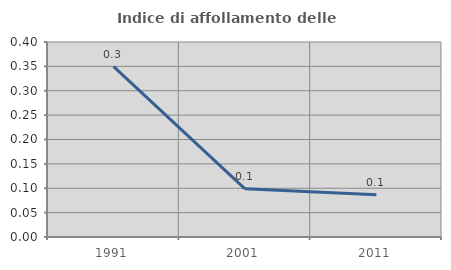
| Category | Indice di affollamento delle abitazioni  |
|---|---|
| 1991.0 | 0.35 |
| 2001.0 | 0.099 |
| 2011.0 | 0.086 |